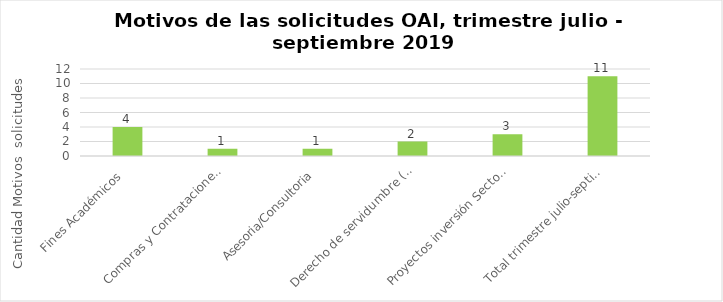
| Category | Motivos de las solicitudes OAI. trimestre julio - septiembre 2019
 |
|---|---|
| Fines Académicos  | 4 |
| Compras y Contrataciones Públicas | 1 |
| Asesoria/Consultoria | 1 |
| Derecho de servidumbre (paso de las lineas por terreno privado) | 2 |
| Proyectos inversión Sector Eléctrico | 3 |
| Total trimestre julio-septiembre | 11 |